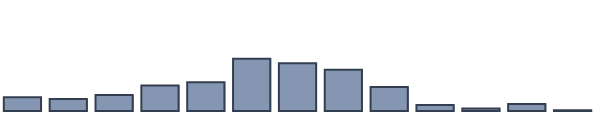
| Category | Series 0 |
|---|---|
| 0 | 4.924 |
| 1 | 4.318 |
| 2 | 5.758 |
| 3 | 9.167 |
| 4 | 10.379 |
| 5 | 18.864 |
| 6 | 17.197 |
| 7 | 14.848 |
| 8 | 8.636 |
| 9 | 2.197 |
| 10 | 0.909 |
| 11 | 2.5 |
| 12 | 0.303 |